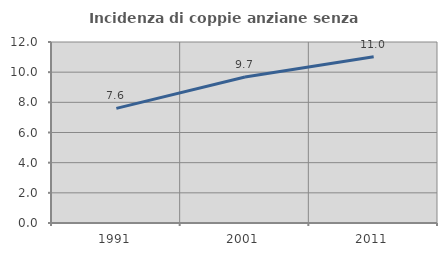
| Category | Incidenza di coppie anziane senza figli  |
|---|---|
| 1991.0 | 7.597 |
| 2001.0 | 9.683 |
| 2011.0 | 11.025 |